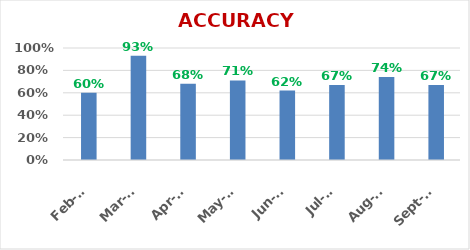
| Category | ACCURACY |
|---|---|
| 2019-09-01 | 0.67 |
| 2019-08-01 | 0.74 |
| 2019-07-01 | 0.67 |
| 2019-06-01 | 0.62 |
| 2019-05-01 | 0.71 |
| 2019-04-01 | 0.68 |
| 2019-03-01 | 0.93 |
| 2019-02-01 | 0.6 |